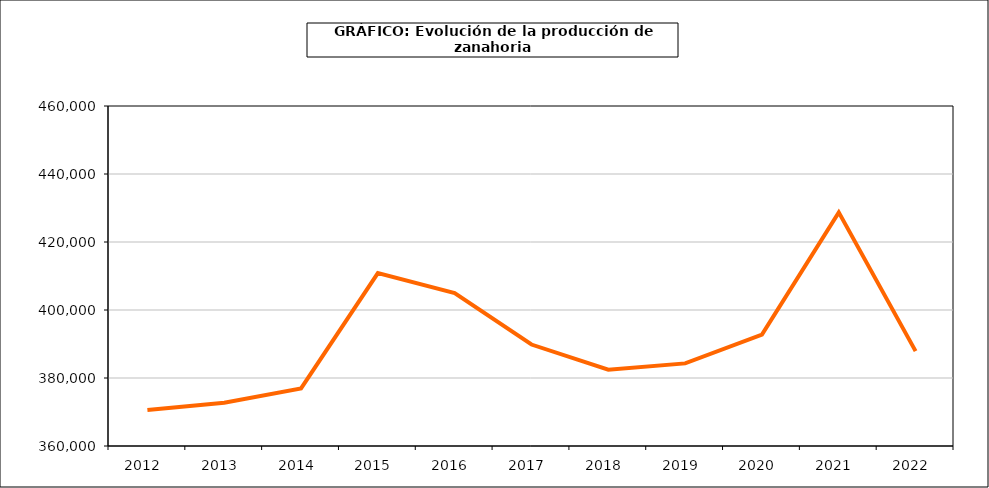
| Category | producción |
|---|---|
| 2012.0 | 370570 |
| 2013.0 | 372714 |
| 2014.0 | 376952 |
| 2015.0 | 410865 |
| 2016.0 | 404962 |
| 2017.0 | 389844 |
| 2018.0 | 382427 |
| 2019.0 | 384295 |
| 2020.0 | 392774 |
| 2021.0 | 428726 |
| 2022.0 | 387907 |